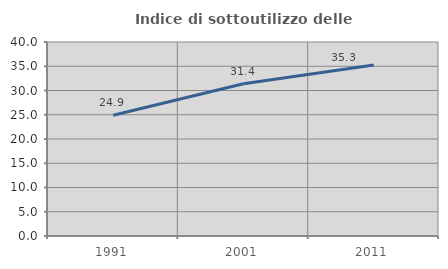
| Category | Indice di sottoutilizzo delle abitazioni  |
|---|---|
| 1991.0 | 24.905 |
| 2001.0 | 31.396 |
| 2011.0 | 35.267 |